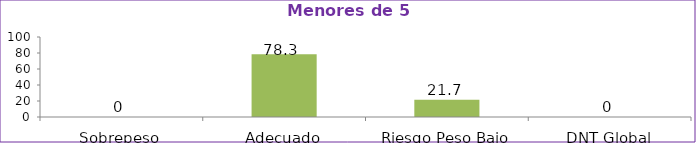
| Category | Series 0 |
|---|---|
| Sobrepeso | 0 |
| Adecuado | 78.3 |
| Riesgo Peso Bajo | 21.7 |
| DNT Global | 0 |